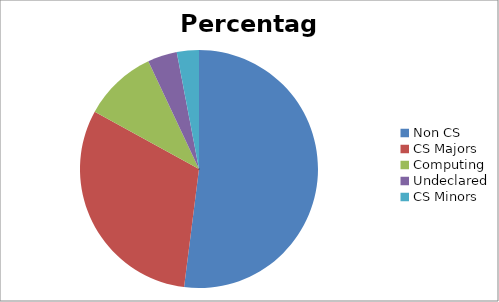
| Category | Percentage |
|---|---|
| Non CS | 52 |
| CS Majors | 31 |
| Computing | 10 |
| Undeclared | 4 |
| CS Minors | 3 |